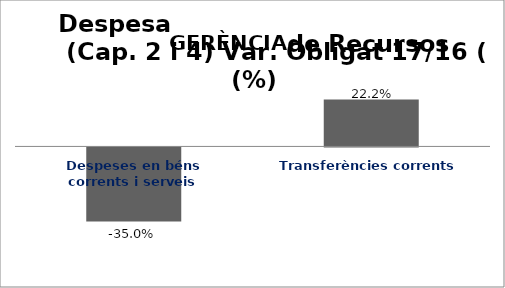
| Category | Series 0 |
|---|---|
| Despeses en béns corrents i serveis | -0.35 |
| Transferències corrents | 0.222 |